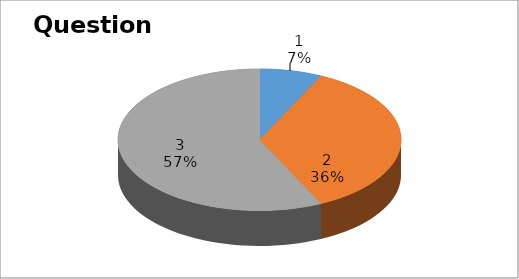
| Category | Series 0 |
|---|---|
| 0 | 3 |
| 1 | 15 |
| 2 | 24 |